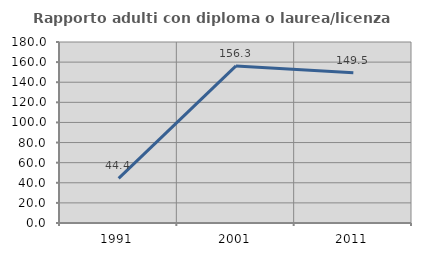
| Category | Rapporto adulti con diploma o laurea/licenza media  |
|---|---|
| 1991.0 | 44.444 |
| 2001.0 | 156.25 |
| 2011.0 | 149.474 |